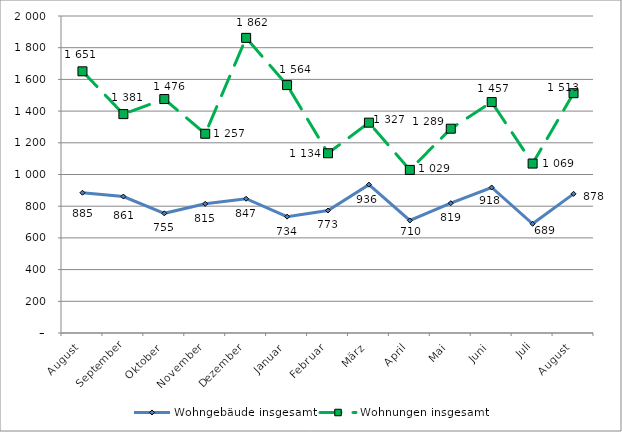
| Category | Wohngebäude insgesamt | Wohnungen insgesamt |
|---|---|---|
| August | 885 | 1651 |
| September | 861 | 1381 |
| Oktober | 755 | 1476 |
| November | 815 | 1257 |
| Dezember | 847 | 1862 |
| Januar | 734 | 1564 |
| Februar | 773 | 1134 |
| März | 936 | 1327 |
| April | 710 | 1029 |
| Mai | 819 | 1289 |
| Juni | 918 | 1457 |
| Juli | 689 | 1069 |
| August | 878 | 1513 |